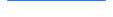
| Category | Series 0 |
|---|---|
| 0 | 381 |
| 1 | 399 |
| 2 | 406 |
| 3 | 354 |
| 4 | 396 |
| 5 | 383 |
| 6 | 393 |
| 7 | 382 |
| 8 | 445 |